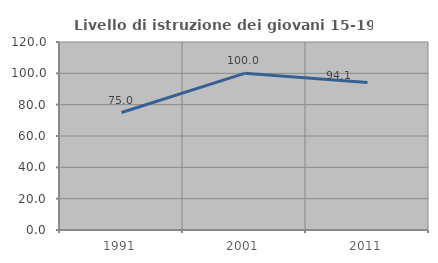
| Category | Livello di istruzione dei giovani 15-19 anni |
|---|---|
| 1991.0 | 75 |
| 2001.0 | 100 |
| 2011.0 | 94.118 |